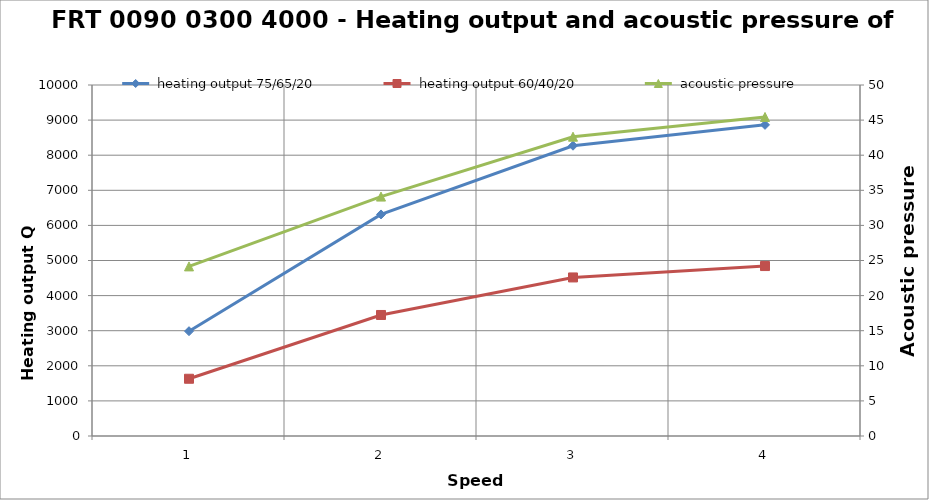
| Category |  heating output 75/65/20 |  heating output 60/40/20 |
|---|---|---|
| 1.0 | 2985.671 | 1630.797 |
| 2.0 | 6312.282 | 3447.819 |
| 3.0 | 8270.259 | 4517.281 |
| 4.0 | 8864.471 | 4841.844 |